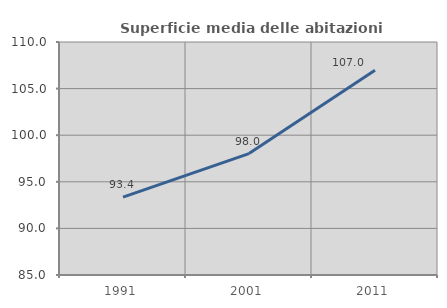
| Category | Superficie media delle abitazioni occupate |
|---|---|
| 1991.0 | 93.353 |
| 2001.0 | 98.025 |
| 2011.0 | 106.956 |